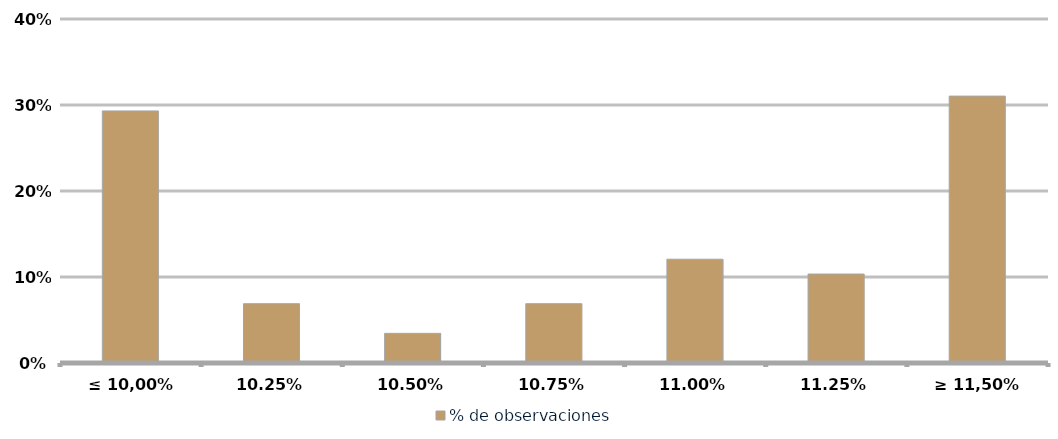
| Category | % de observaciones  |
|---|---|
| ≤ 10,00% | 0.293 |
| 10,25% | 0.069 |
| 10,50% | 0.034 |
| 10,75% | 0.069 |
| 11,00% | 0.121 |
| 11,25% | 0.103 |
| ≥ 11,50% | 0.31 |